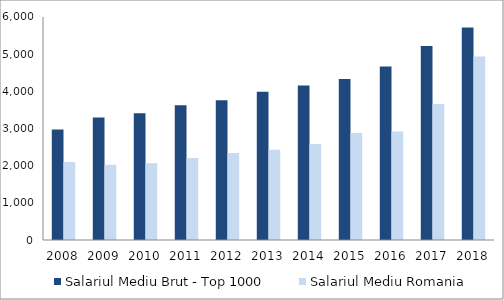
| Category | Salariul Mediu Brut - Top 1000 | Salariul Mediu Romania |
|---|---|---|
| 2008.0 | 2971.025 | 2098 |
| 2009.0 | 3296.639 | 2023 |
| 2010.0 | 3411.882 | 2067 |
| 2011.0 | 3626.262 | 2209 |
| 2012.0 | 3758.602 | 2343 |
| 2013.0 | 3990.561 | 2430 |
| 2014.0 | 4155.864 | 2582 |
| 2015.0 | 4331.42 | 2880 |
| 2016.0 | 4665.285 | 2918 |
| 2017.0 | 5218.665 | 3662 |
| 2018.0 | 5717.708 | 4938 |